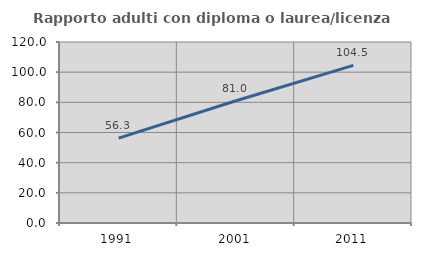
| Category | Rapporto adulti con diploma o laurea/licenza media  |
|---|---|
| 1991.0 | 56.272 |
| 2001.0 | 81.039 |
| 2011.0 | 104.484 |